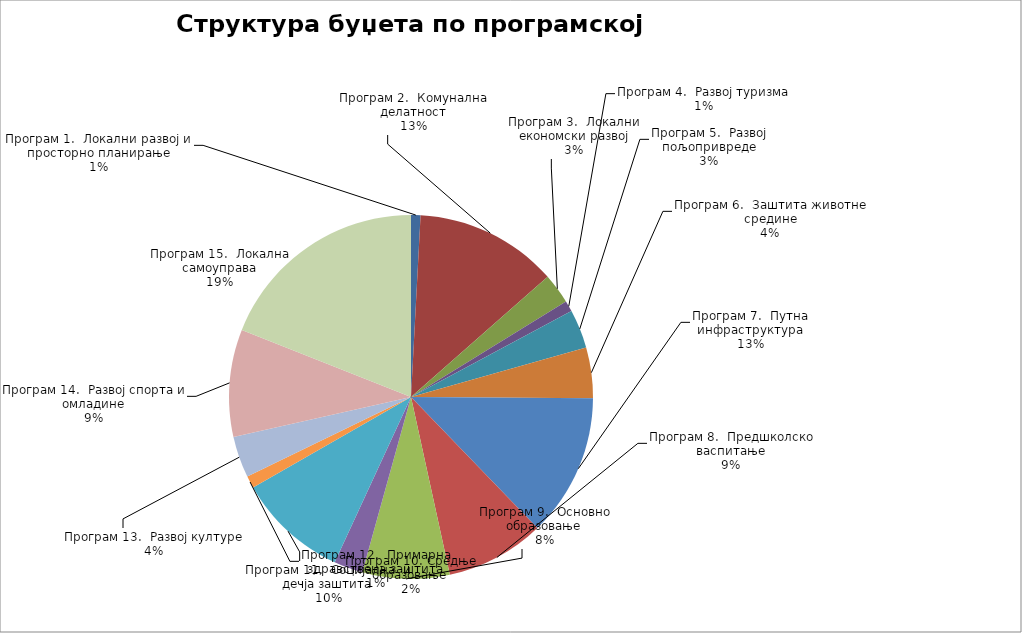
| Category | Series 0 |
|---|---|
| Програм 1.  Локални развој и просторно планирање | 7000000 |
| Програм 2.  Комунална делатност | 105870000 |
| Програм 3.  Локални економски развој | 22540000 |
| Програм 4.  Развој туризма | 8000000 |
| Програм 5.  Развој пољопривреде | 28800000 |
| Програм 6.  Заштита животне средине | 37430000 |
| Програм 7.  Путна инфраструктура | 105900000 |
| Програм 8.  Предшколско васпитање | 73400000 |
| Програм 9.  Основно образовање | 64600000 |
| Програм 10. Средње образовање | 21500000 |
| Програм 11.  Социјална  и дечја заштита | 82170000 |
| Програм 12.  Примарна здравствена заштита | 9000000 |
| Програм 13.  Развој културе | 30600000 |
| Програм 14.  Развој спорта и омладине | 79630359 |
| Програм 15.  Локална самоуправа | 158639641 |